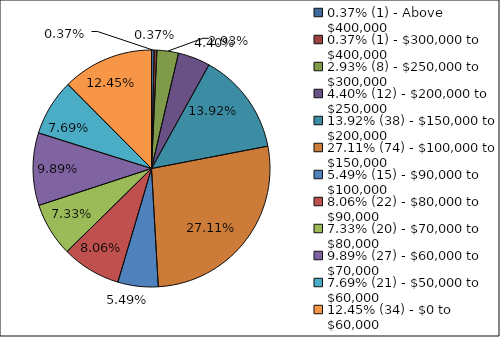
| Category | Series 0 |
|---|---|
| 0.37% (1) - Above $400,000 | 0.004 |
| 0.37% (1) - $300,000 to $400,000 | 0.004 |
| 2.93% (8) - $250,000 to $300,000 | 0.029 |
| 4.40% (12) - $200,000 to $250,000 | 0.044 |
| 13.92% (38) - $150,000 to $200,000 | 0.139 |
| 27.11% (74) - $100,000 to $150,000 | 0.271 |
| 5.49% (15) - $90,000 to $100,000 | 0.055 |
| 8.06% (22) - $80,000 to $90,000 | 0.081 |
| 7.33% (20) - $70,000 to $80,000 | 0.073 |
| 9.89% (27) - $60,000 to $70,000 | 0.099 |
| 7.69% (21) - $50,000 to $60,000 | 0.077 |
| 12.45% (34) - $0 to $60,000 | 0.125 |